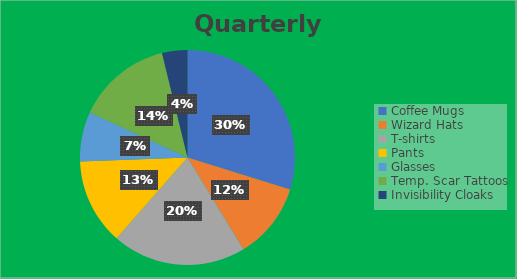
| Category | Quarterly Sales |
|---|---|
| Coffee Mugs | 10130 |
| Wizard Hats | 3902 |
| T-shirts | 6853 |
| Pants | 4399 |
| Glasses | 2539 |
| Temp. Scar Tattoos | 4862 |
| Invisibility Cloaks | 1296.87 |